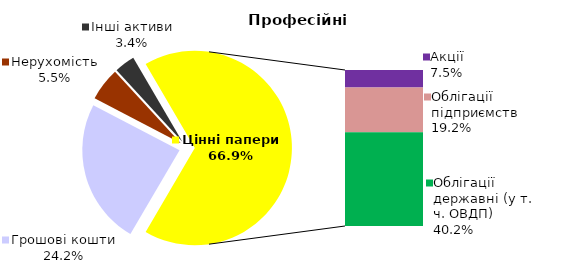
| Category | Професійні |
|---|---|
| Грошові кошти | 30.954 |
| Банківські метали | 0 |
| Нерухомість | 7.062 |
| Інші активи | 4.346 |
| Акції | 9.535 |
| Облігації підприємств | 24.564 |
| Муніципальні облігації | 0 |
| Облігації державні (у т. ч. ОВДП) | 51.389 |